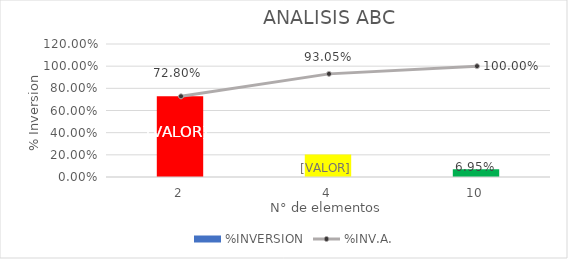
| Category | %INVERSION |
|---|---|
| 2.0 | 0.728 |
| 4.0 | 0.202 |
| 10.0 | 0.07 |